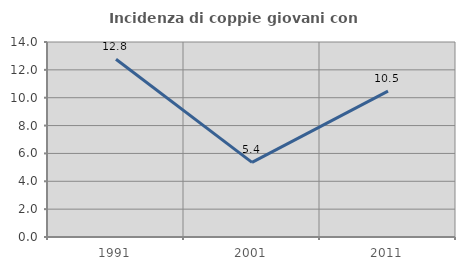
| Category | Incidenza di coppie giovani con figli |
|---|---|
| 1991.0 | 12.766 |
| 2001.0 | 5.357 |
| 2011.0 | 10.476 |